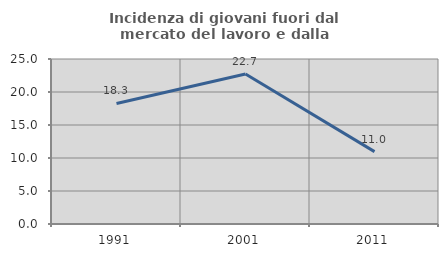
| Category | Incidenza di giovani fuori dal mercato del lavoro e dalla formazione  |
|---|---|
| 1991.0 | 18.263 |
| 2001.0 | 22.72 |
| 2011.0 | 10.961 |